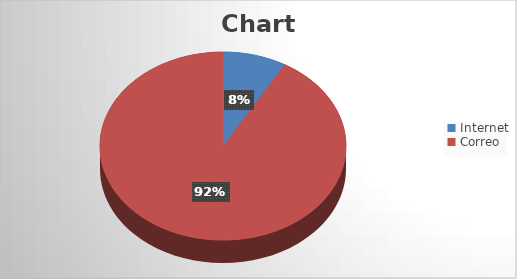
| Category | Series 0 |
|---|---|
| Internet | 1 |
| Correo | 11 |